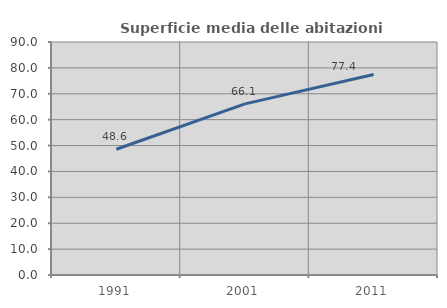
| Category | Superficie media delle abitazioni occupate |
|---|---|
| 1991.0 | 48.565 |
| 2001.0 | 66.094 |
| 2011.0 | 77.417 |